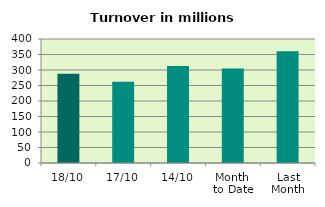
| Category | Series 0 |
|---|---|
| 18/10 | 287.558 |
| 17/10 | 262.402 |
| 14/10 | 313.05 |
| Month 
to Date | 304.823 |
| Last
Month | 360.198 |